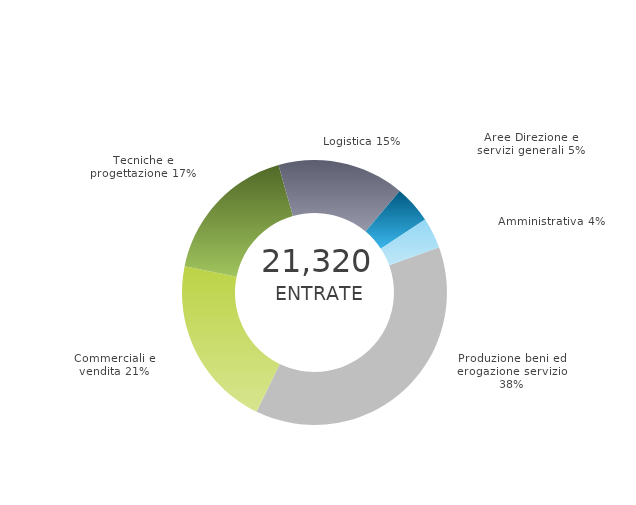
| Category | Series 0 | Series 1 |
|---|---|---|
| Produzione beni ed erogazione servizio | 0 | 0.378 |
| Commerciali e vendita | 0 | 0.21 |
| Tecniche e progettazione | 0 | 0.174 |
| Logistica | 0 | 0.155 |
| Aree Direzione e servizi generali | 0 | 0.046 |
| Amministrativa | 0 | 0.037 |